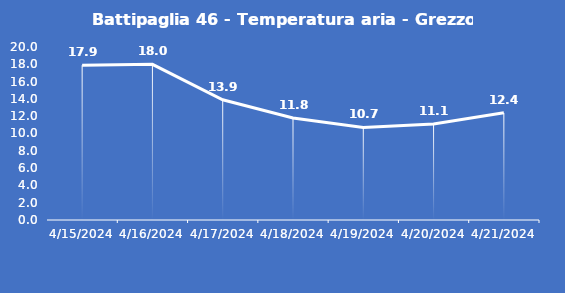
| Category | Battipaglia 46 - Temperatura aria - Grezzo (°C) |
|---|---|
| 4/15/24 | 17.9 |
| 4/16/24 | 18 |
| 4/17/24 | 13.9 |
| 4/18/24 | 11.8 |
| 4/19/24 | 10.7 |
| 4/20/24 | 11.1 |
| 4/21/24 | 12.4 |